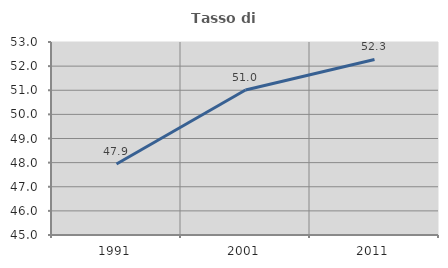
| Category | Tasso di occupazione   |
|---|---|
| 1991.0 | 47.941 |
| 2001.0 | 51.008 |
| 2011.0 | 52.276 |